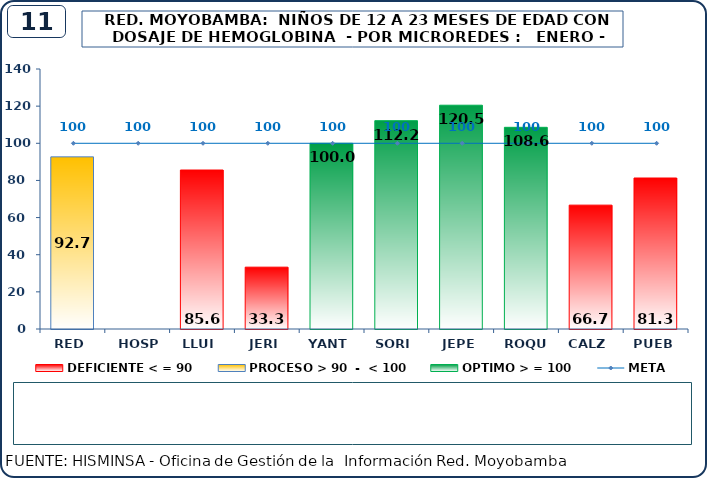
| Category | DEFICIENTE < = 90 | PROCESO > 90  -  < 100 | OPTIMO > = 100 |
|---|---|---|---|
| RED | 0 | 92.7 | 0 |
| HOSP | 0 | 0 | 0 |
| LLUI | 85.6 | 0 | 0 |
| JERI | 33.3 | 0 | 0 |
| YANT | 0 | 0 | 100 |
| SORI | 0 | 0 | 112.2 |
| JEPE | 0 | 0 | 120.5 |
| ROQU | 0 | 0 | 108.6 |
| CALZ | 66.7 | 0 | 0 |
| PUEB | 81.3 | 0 | 0 |